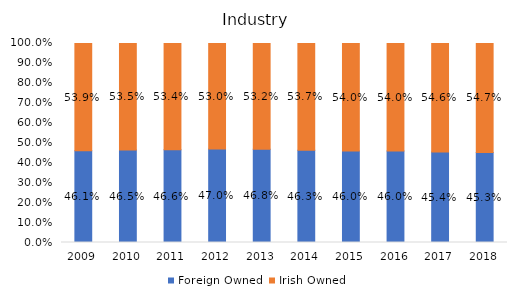
| Category | Foreign Owned | Irish Owned |
|---|---|---|
| 2009.0 | 0.461 | 0.539 |
| 2010.0 | 0.465 | 0.535 |
| 2011.0 | 0.466 | 0.534 |
| 2012.0 | 0.47 | 0.53 |
| 2013.0 | 0.468 | 0.532 |
| 2014.0 | 0.463 | 0.537 |
| 2015.0 | 0.46 | 0.54 |
| 2016.0 | 0.46 | 0.54 |
| 2017.0 | 0.454 | 0.546 |
| 2018.0 | 0.453 | 0.547 |